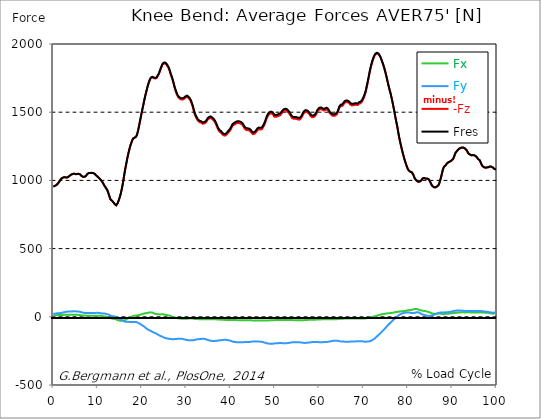
| Category |  Fx |  Fy |  -Fz |  Fres |
|---|---|---|---|---|
| 0.0 | 11.994 | 21.394 | 954.383 | 954.986 |
| 0.167348456675344 | 11.903 | 21.915 | 956.968 | 957.571 |
| 0.334696913350688 | 11.812 | 22.436 | 959.544 | 960.147 |
| 0.5020453700260321 | 11.967 | 23.651 | 962.02 | 962.632 |
| 0.669393826701376 | 12.232 | 24.948 | 965.318 | 965.939 |
| 0.83674228337672 | 12.552 | 25.871 | 970.945 | 971.566 |
| 1.0040907400520642 | 12.935 | 26.894 | 976.179 | 976.81 |
| 1.1621420602454444 | 13.045 | 27.287 | 981.624 | 982.245 |
| 1.3294905169207885 | 12.57 | 26.784 | 989.681 | 990.284 |
| 1.4968389735961325 | 12.89 | 27.031 | 999.319 | 999.922 |
| 1.6641874302714765 | 13.52 | 27.935 | 1007.339 | 1007.951 |
| 1.8315358869468206 | 13.62 | 29.004 | 1013.323 | 1013.944 |
| 1.9988843436221646 | 13.812 | 30.338 | 1017.443 | 1018.082 |
| 2.1662328002975086 | 13.949 | 31.608 | 1020.357 | 1021.033 |
| 2.333581256972853 | 14.196 | 32.877 | 1022.312 | 1023.015 |
| 2.5009297136481967 | 14.662 | 34.193 | 1023.116 | 1023.865 |
| 2.6682781703235405 | 14.909 | 35.399 | 1022.759 | 1023.554 |
| 2.8356266269988843 | 15.146 | 36.385 | 1020.211 | 1021.033 |
| 3.002975083674229 | 15.575 | 37.509 | 1020.101 | 1020.951 |
| 3.1703235403495724 | 16.005 | 38.477 | 1021.8 | 1022.677 |
| 3.337671997024917 | 15.813 | 38.395 | 1024.376 | 1025.253 |
| 3.4957233172182973 | 15.155 | 37.993 | 1027.628 | 1028.478 |
| 3.663071773893641 | 14.726 | 38.221 | 1033.612 | 1034.471 |
| 3.8304202305689854 | 14.58 | 38.45 | 1038.581 | 1039.449 |
| 3.997768687244329 | 14.872 | 38.888 | 1041.505 | 1042.382 |
| 4.165117143919673 | 15.374 | 39.308 | 1044.236 | 1045.131 |
| 4.332465600595017 | 15.676 | 39.729 | 1046.337 | 1047.251 |
| 4.499814057270361 | 15.776 | 40.195 | 1047.945 | 1048.877 |
| 4.667162513945706 | 15.785 | 40.542 | 1049.078 | 1050.028 |
| 4.834510970621049 | 15.511 | 40.496 | 1048.237 | 1049.187 |
| 5.001859427296393 | 15.402 | 40.651 | 1045.935 | 1046.894 |
| 5.169207883971737 | 15.274 | 40.14 | 1045.113 | 1046.063 |
| 5.336556340647081 | 14.516 | 38.943 | 1045.789 | 1046.684 |
| 5.503904797322425 | 13.812 | 38.623 | 1047.141 | 1048.009 |
| 5.671253253997769 | 13.228 | 38.249 | 1047.863 | 1048.721 |
| 5.82930457419115 | 12.926 | 37.819 | 1046.922 | 1047.762 |
| 5.996653030866494 | 12.725 | 36.979 | 1044.273 | 1045.095 |
| 6.164001487541838 | 12.223 | 35.737 | 1040.29 | 1041.085 |
| 6.331349944217181 | 10.642 | 33.069 | 1032.744 | 1033.539 |
| 6.498698400892526 | 9.61 | 31.196 | 1027.336 | 1028.14 |
| 6.66604685756787 | 9.364 | 30.347 | 1026.103 | 1026.916 |
| 6.833395314243213 | 9.19 | 29.178 | 1025.345 | 1026.121 |
| 7.000743770918558 | 8.98 | 28.739 | 1025.719 | 1026.505 |
| 7.168092227593902 | 8.77 | 28.611 | 1027.473 | 1028.277 |
| 7.335440684269246 | 8.496 | 28.392 | 1031.374 | 1032.214 |
| 7.50278914094459 | 8.075 | 27.634 | 1037.494 | 1038.362 |
| 7.6701375976199335 | 7.674 | 27.424 | 1046.684 | 1047.57 |
| 7.837486054295278 | 7.436 | 27.716 | 1050.558 | 1051.453 |
| 7.995537374488658 | 7.409 | 27.552 | 1053.581 | 1054.458 |
| 8.162885831164003 | 7.39 | 27.57 | 1055.043 | 1055.92 |
| 8.330234287839346 | 7.701 | 27.524 | 1054.139 | 1055.016 |
| 8.49758274451469 | 7.902 | 27.332 | 1053.627 | 1054.495 |
| 8.664931201190035 | 7.82 | 27.077 | 1054.632 | 1055.5 |
| 8.832279657865378 | 7.728 | 27.095 | 1054.824 | 1055.682 |
| 8.999628114540721 | 7.728 | 27.506 | 1053.371 | 1054.248 |
| 9.166976571216066 | 7.811 | 27.89 | 1050.969 | 1051.855 |
| 9.334325027891412 | 7.829 | 28.346 | 1046.894 | 1047.808 |
| 9.501673484566755 | 7.929 | 28.849 | 1041.569 | 1042.5 |
| 9.669021941242098 | 8.313 | 29.041 | 1035.686 | 1036.636 |
| 9.836370397917442 | 8.587 | 29.05 | 1030.488 | 1031.438 |
| 10.003718854592787 | 8.541 | 29.141 | 1026.468 | 1027.418 |
| 10.17106731126813 | 8.514 | 28.949 | 1021.901 | 1022.842 |
| 10.329118631461512 | 8.249 | 28.282 | 1016.073 | 1017.004 |
| 10.496467088136853 | 7.555 | 26.711 | 1010.144 | 1011.03 |
| 10.663815544812199 | 6.998 | 25.999 | 1004.343 | 1005.183 |
| 10.831164001487544 | 5.938 | 25.24 | 997.802 | 998.634 |
| 10.998512458162887 | 5.116 | 24.802 | 990.193 | 991.006 |
| 11.16586091483823 | 4.769 | 25.167 | 981.761 | 982.583 |
| 11.333209371513574 | 3.855 | 24.628 | 971.785 | 972.571 |
| 11.50055782818892 | 2.403 | 23.559 | 961.728 | 962.477 |
| 11.667906284864264 | 2.165 | 23.514 | 953.433 | 954.155 |
| 11.835254741539607 | 0.676 | 21.394 | 944.855 | 945.495 |
| 12.00260319821495 | -0.731 | 19.202 | 937.291 | 937.858 |
| 12.169951654890292 | -1.608 | 18.416 | 927.909 | 928.448 |
| 12.337300111565641 | -2.576 | 17.841 | 914.353 | 914.883 |
| 12.504648568240984 | -4.083 | 15.776 | 897.279 | 897.764 |
| 12.662699888434362 | -6.376 | 12.881 | 880.608 | 881.037 |
| 12.830048345109708 | -8.678 | 9.948 | 864.402 | 864.795 |
| 12.997396801785053 | -10.944 | 6.723 | 856.729 | 857.131 |
| 13.164745258460396 | -12.597 | 4.33 | 852.444 | 852.883 |
| 13.33209371513574 | -13.657 | 3.755 | 847.201 | 847.639 |
| 13.499442171811083 | -14.634 | 3.27 | 841.857 | 842.286 |
| 13.666790628486426 | -15.027 | 3.462 | 833.818 | 834.229 |
| 13.834139085161771 | -16.014 | 2.266 | 826.363 | 826.774 |
| 14.001487541837117 | -17.311 | 0.365 | 819.211 | 819.631 |
| 14.16883599851246 | -18.901 | -2.028 | 817.237 | 817.685 |
| 14.336184455187803 | -21.458 | -5.737 | 822.636 | 823.139 |
| 14.503532911863147 | -24.272 | -10.076 | 832.429 | 833.023 |
| 14.670881368538492 | -26.172 | -13.493 | 846.342 | 847.018 |
| 14.828932688731873 | -27.725 | -16.745 | 862.493 | 863.242 |
| 14.996281145407215 | -28.52 | -18.581 | 878.534 | 879.338 |
| 15.163629602082558 | -28.62 | -20.837 | 897.901 | 898.732 |
| 15.330978058757903 | -28.52 | -23.295 | 920.556 | 921.433 |
| 15.498326515433247 | -28.301 | -25.569 | 946.828 | 947.742 |
| 15.665674972108594 | -27.67 | -27.707 | 975.851 | 976.801 |
| 15.833023428783937 | -27.862 | -30.822 | 1008.49 | 1009.523 |
| 16.00037188545928 | -27.003 | -34.147 | 1041.541 | 1042.619 |
| 16.167720342134626 | -24.245 | -35.426 | 1075.46 | 1076.501 |
| 16.335068798809967 | -21.394 | -36.175 | 1103.048 | 1104.035 |
| 16.502417255485312 | -17.667 | -35.746 | 1130.947 | 1131.869 |
| 16.669765712160658 | -14.452 | -35.746 | 1159.065 | 1159.951 |
| 16.837114168836 | -10.926 | -36.431 | 1185.036 | 1185.913 |
| 17.004462625511344 | -8.267 | -37.171 | 1207.773 | 1208.65 |
| 17.16251394570472 | -5.646 | -37.993 | 1230.319 | 1231.223 |
| 17.32986240238007 | -2.804 | -38.395 | 1249.923 | 1250.827 |
| 17.497210859055414 | -0.758 | -38.532 | 1266.192 | 1267.097 |
| 17.664559315730756 | 1.279 | -38.66 | 1282.115 | 1283.019 |
| 17.8319077724061 | 3.362 | -38.696 | 1296.347 | 1297.233 |
| 17.999256229081443 | 5.445 | -38.861 | 1307.2 | 1308.095 |
| 18.166604685756788 | 7.153 | -38.925 | 1313.439 | 1314.334 |
| 18.333953142432133 | 7.893 | -38.24 | 1312.334 | 1313.22 |
| 18.501301599107478 | 8.514 | -37.774 | 1312.654 | 1313.521 |
| 18.668650055782823 | 8.98 | -38.413 | 1320.336 | 1321.231 |
| 18.835998512458165 | 9.345 | -39.811 | 1332.111 | 1333.061 |
| 19.00334696913351 | 10.396 | -41.857 | 1350.135 | 1351.149 |
| 19.170695425808855 | 11.702 | -44.662 | 1372.817 | 1373.923 |
| 19.338043882484197 | 13.008 | -47.722 | 1399.136 | 1400.332 |
| 19.496095202677576 | 14.306 | -50.819 | 1426.715 | 1427.994 |
| 19.66344365935292 | 15.585 | -54.107 | 1454.138 | 1455.518 |
| 19.830792116028263 | 17.064 | -57.807 | 1481.297 | 1482.823 |
| 19.998140572703612 | 18.855 | -61.214 | 1507.798 | 1509.479 |
| 20.165489029378953 | 20.572 | -64.741 | 1532.755 | 1534.591 |
| 20.3328374860543 | 22.6 | -68.468 | 1558.151 | 1560.151 |
| 20.500185942729644 | 24.254 | -72.688 | 1585.173 | 1587.365 |
| 20.667534399404985 | 25.542 | -76.662 | 1610.075 | 1612.441 |
| 20.83488285608033 | 26.053 | -81.275 | 1632.145 | 1634.758 |
| 21.002231312755672 | 26.51 | -85.633 | 1653.43 | 1656.253 |
| 21.16957976943102 | 27.853 | -89.698 | 1675.756 | 1678.789 |
| 21.336928226106362 | 29.58 | -93.05 | 1695.717 | 1698.941 |
| 21.504276682781704 | 30.758 | -96.248 | 1713.174 | 1716.554 |
| 21.67162513945705 | 31.699 | -99.116 | 1728.731 | 1732.257 |
| 21.82967645965043 | 32.32 | -101.592 | 1741.045 | 1744.708 |
| 21.997024916325774 | 32.53 | -103.985 | 1750.244 | 1754.026 |
| 22.16437337300112 | 32.083 | -106.726 | 1755.205 | 1759.124 |
| 22.33172182967646 | 30.557 | -109.722 | 1755.415 | 1759.471 |
| 22.499070286351806 | 28.355 | -112.919 | 1754.711 | 1758.895 |
| 22.666418743027148 | 25.77 | -115.249 | 1749.806 | 1754.118 |
| 22.833767199702496 | 23.569 | -117.377 | 1746.837 | 1751.277 |
| 23.00111565637784 | 21.851 | -119.634 | 1747.193 | 1751.761 |
| 23.168464113053183 | 20.326 | -122.338 | 1747.54 | 1752.281 |
| 23.335812569728528 | 19.321 | -125.818 | 1751.249 | 1756.228 |
| 23.50316102640387 | 18.827 | -128.486 | 1761.983 | 1767.117 |
| 23.670509483079215 | 18.298 | -132.039 | 1772.105 | 1777.467 |
| 23.83785793975456 | 17.421 | -135.52 | 1782.299 | 1787.89 |
| 23.995909259947936 | 17.539 | -138.47 | 1796.797 | 1802.57 |
| 24.163257716623285 | 17.96 | -140.69 | 1812.016 | 1817.917 |
| 24.330606173298627 | 17.85 | -142.873 | 1827.08 | 1833.109 |
| 24.49795462997397 | 18.06 | -145.139 | 1839.449 | 1845.633 |
| 24.665303086649313 | 18.124 | -147.505 | 1850.475 | 1856.824 |
| 24.83265154332466 | 17.539 | -150.136 | 1856.358 | 1862.908 |
| 25.0 | 16.708 | -152.447 | 1858.121 | 1864.826 |
| 25.167348456675345 | 15.84 | -154.32 | 1858.331 | 1865.182 |
| 25.334696913350694 | 14.854 | -155.946 | 1855.088 | 1862.067 |
| 25.502045370026035 | 13.739 | -157.544 | 1849.552 | 1856.678 |
| 25.669393826701377 | 12.506 | -159.061 | 1841.696 | 1848.94 |
| 25.836742283376722 | 11.492 | -160.002 | 1832.415 | 1839.768 |
| 26.004090740052067 | 10.167 | -160.97 | 1821.982 | 1829.455 |
| 26.17143919672741 | 8.642 | -161.947 | 1808.417 | 1816.008 |
| 26.329490516920792 | 7.226 | -162.048 | 1792.056 | 1799.702 |
| 26.49683897359613 | 4.906 | -161.838 | 1772.169 | 1779.815 |
| 26.66418743027148 | 2.202 | -163.217 | 1758.749 | 1766.541 |
| 26.831535886946828 | -0.091 | -164.642 | 1742.397 | 1750.372 |
| 26.998884343622166 | -1.717 | -165.273 | 1723.159 | 1731.261 |
| 27.166232800297514 | -2.914 | -164.176 | 1702.988 | 1711.119 |
| 27.333581256972852 | -4.476 | -163.245 | 1680.708 | 1688.893 |
| 27.5009297136482 | -5.7 | -162.742 | 1663.506 | 1671.746 |
| 27.668278170323543 | -7.208 | -162.578 | 1646.78 | 1655.102 |
| 27.835626626998888 | -8.688 | -161.856 | 1632.209 | 1640.55 |
| 28.002975083674233 | -9.957 | -161.335 | 1619.868 | 1628.226 |
| 28.170323540349575 | -11.063 | -160.997 | 1610.276 | 1618.671 |
| 28.33767199702492 | -12.159 | -160.796 | 1604.658 | 1613.08 |
| 28.50502045370026 | -12.771 | -160.257 | 1599.588 | 1608.001 |
| 28.663071773893645 | -13.109 | -160.431 | 1595.751 | 1604.228 |
| 28.830420230568986 | -13.429 | -160.833 | 1592.983 | 1601.534 |
| 28.99776868724433 | -13.566 | -161.089 | 1590.992 | 1599.588 |
| 29.165117143919673 | -13.383 | -161.947 | 1592.828 | 1601.524 |
| 29.33246560059502 | -13.593 | -163.948 | 1597.231 | 1606.129 |
| 29.499814057270367 | -13.529 | -165.227 | 1598.619 | 1607.636 |
| 29.66716251394571 | -13.748 | -166.497 | 1603.434 | 1612.551 |
| 29.834510970621054 | -13.748 | -167.803 | 1607.453 | 1616.68 |
| 30.00185942729639 | -13.675 | -169.137 | 1611.043 | 1620.388 |
| 30.169207883971744 | -13.474 | -170.197 | 1611.902 | 1621.348 |
| 30.33655634064708 | -13.301 | -171.055 | 1609.171 | 1618.735 |
| 30.50390479732243 | -12.533 | -171.357 | 1603.744 | 1613.391 |
| 30.671253253997772 | -11.693 | -171.402 | 1598.062 | 1607.764 |
| 30.829304574191156 | -11.163 | -171.896 | 1590.343 | 1600.154 |
| 30.996653030866494 | -11.328 | -172.362 | 1579.472 | 1589.411 |
| 31.164001487541842 | -11.949 | -172.736 | 1565.614 | 1575.672 |
| 31.331349944217187 | -12.552 | -172.435 | 1550.331 | 1560.435 |
| 31.498698400892525 | -13.337 | -172.27 | 1532.518 | 1542.694 |
| 31.666046857567874 | -14.333 | -171.676 | 1510.84 | 1521.071 |
| 31.833395314243212 | -15.247 | -169.694 | 1489.811 | 1499.96 |
| 32.00074377091856 | -15.667 | -168.598 | 1475.779 | 1485.883 |
| 32.1680922275939 | -15.804 | -166.844 | 1463.529 | 1473.505 |
| 32.33544068426925 | -16.215 | -165.273 | 1453.608 | 1463.456 |
| 32.50278914094459 | -16.617 | -164.56 | 1443.414 | 1453.261 |
| 32.670137597619934 | -17.064 | -164.103 | 1435.74 | 1445.588 |
| 32.83748605429528 | -17.412 | -163.793 | 1430.762 | 1440.609 |
| 33.004834510970625 | -17.795 | -163.647 | 1426.769 | 1436.617 |
| 33.162885831164004 | -17.987 | -163.336 | 1425.153 | 1434.982 |
| 33.33023428783935 | -17.896 | -162.724 | 1423.664 | 1433.429 |
| 33.497582744514695 | -17.613 | -161.893 | 1420.119 | 1429.821 |
| 33.664931201190036 | -17.284 | -161.134 | 1415.953 | 1425.6 |
| 33.83227965786538 | -17.101 | -161.162 | 1415.524 | 1425.171 |
| 33.99962811454073 | -17.265 | -161.591 | 1417.534 | 1427.217 |
| 34.16697657121607 | -17.412 | -162.898 | 1419.151 | 1428.989 |
| 34.33432502789141 | -17.43 | -164.414 | 1422.503 | 1432.506 |
| 34.50167348456676 | -17.265 | -165.693 | 1428.386 | 1438.508 |
| 34.6690219412421 | -17.375 | -167.483 | 1437.668 | 1447.936 |
| 34.83637039791744 | -17.421 | -169.95 | 1446.949 | 1457.436 |
| 35.00371885459279 | -17.457 | -171.375 | 1452.558 | 1463.182 |
| 35.17106731126814 | -17.594 | -173.312 | 1455.189 | 1466.032 |
| 35.338415767943474 | -17.613 | -174.965 | 1457.564 | 1468.599 |
| 35.49646708813686 | -17.64 | -175.705 | 1457.957 | 1469.074 |
| 35.6638155448122 | -17.75 | -176.262 | 1455.362 | 1466.589 |
| 35.831164001487544 | -18.142 | -177.112 | 1449.827 | 1461.227 |
| 35.998512458162885 | -18.243 | -177.66 | 1445.323 | 1456.833 |
| 36.165860914838234 | -18.252 | -177.87 | 1440.253 | 1451.827 |
| 36.333209371513576 | -18.252 | -177.404 | 1432.214 | 1443.797 |
| 36.50055782818892 | -18.343 | -176.719 | 1423.024 | 1434.589 |
| 36.667906284864266 | -18.535 | -175.623 | 1412.208 | 1423.718 |
| 36.83525474153961 | -18.946 | -175.102 | 1399.693 | 1411.24 |
| 37.002603198214956 | -19.403 | -174.929 | 1387.059 | 1398.697 |
| 37.1699516548903 | -19.476 | -174.088 | 1374.635 | 1386.283 |
| 37.337300111565646 | -19.659 | -172.636 | 1365.226 | 1376.755 |
| 37.50464856824098 | -20.335 | -171.932 | 1357.47 | 1368.999 |
| 37.66269988843437 | -20.609 | -171.695 | 1353.04 | 1364.578 |
| 37.83004834510971 | -20.883 | -171.366 | 1349.861 | 1361.371 |
| 37.99739680178505 | -21.267 | -171.019 | 1344.033 | 1355.561 |
| 38.16474525846039 | -21.422 | -170.169 | 1336.451 | 1347.942 |
| 38.33209371513574 | -21.815 | -169.429 | 1331.636 | 1343.083 |
| 38.49944217181109 | -22.262 | -168.899 | 1329.051 | 1340.47 |
| 38.666790628486424 | -22.555 | -168.753 | 1328.348 | 1339.757 |
| 38.83413908516178 | -22.865 | -168.689 | 1328.713 | 1340.114 |
| 39.001487541837115 | -23.002 | -169.018 | 1333.244 | 1344.654 |
| 39.16883599851246 | -23.304 | -169.721 | 1339.52 | 1350.984 |
| 39.336184455187805 | -23.45 | -170.644 | 1346.426 | 1357.964 |
| 39.503532911863154 | -23.66 | -171.667 | 1352.921 | 1364.55 |
| 39.670881368538495 | -23.934 | -173.156 | 1358.311 | 1370.077 |
| 39.83822982521384 | -23.888 | -174.664 | 1364.906 | 1376.819 |
| 39.996281145407224 | -23.806 | -175.723 | 1374.16 | 1386.118 |
| 40.163629602082565 | -24.098 | -177.651 | 1384.383 | 1396.505 |
| 40.33097805875791 | -24.254 | -180.675 | 1395.573 | 1407.988 |
| 40.498326515433256 | -24.235 | -181.99 | 1401.721 | 1414.236 |
| 40.6656749721086 | -24.245 | -183.059 | 1406.782 | 1419.388 |
| 40.83302342878393 | -24.226 | -183.963 | 1410.116 | 1422.796 |
| 41.00037188545929 | -24.062 | -184.539 | 1413.122 | 1425.838 |
| 41.16772034213463 | -24.135 | -185.525 | 1415.926 | 1428.752 |
| 41.33506879880997 | -24.19 | -186.165 | 1419.589 | 1432.452 |
| 41.50241725548531 | -24.327 | -186.265 | 1421.398 | 1434.251 |
| 41.66976571216066 | -24.665 | -186.923 | 1420.585 | 1433.529 |
| 41.837114168836 | -24.793 | -187.234 | 1420.183 | 1433.182 |
| 42.004462625511344 | -24.848 | -187.444 | 1419.562 | 1432.589 |
| 42.17181108218669 | -24.921 | -187.672 | 1417.908 | 1430.981 |
| 42.32986240238007 | -24.838 | -187.398 | 1414.583 | 1427.646 |
| 42.497210859055414 | -24.756 | -187.124 | 1411.249 | 1424.303 |
| 42.66455931573076 | -24.802 | -186.85 | 1406.955 | 1420.019 |
| 42.831907772406105 | -25.049 | -186.567 | 1399.912 | 1412.994 |
| 42.999256229081446 | -25.396 | -185.735 | 1388.722 | 1401.812 |
| 43.16660468575679 | -25.697 | -185.617 | 1379.386 | 1392.568 |
| 43.33395314243214 | -25.88 | -185.388 | 1373.64 | 1386.858 |
| 43.50130159910748 | -25.944 | -185.16 | 1370.031 | 1383.259 |
| 43.66865005578282 | -26.072 | -185.343 | 1368.624 | 1381.898 |
| 43.83599851245817 | -26.099 | -185.251 | 1368.359 | 1381.615 |
| 44.00334696913351 | -26.126 | -185.151 | 1368.104 | 1381.35 |
| 44.17069542580886 | -26.154 | -184.639 | 1366.231 | 1379.422 |
| 44.3380438824842 | -26.181 | -184.054 | 1363.427 | 1376.554 |
| 44.49609520267758 | -26.327 | -183.817 | 1358.448 | 1371.584 |
| 44.66344365935292 | -26.181 | -182.629 | 1350.382 | 1363.436 |
| 44.83079211602827 | -26.209 | -181.643 | 1344.48 | 1357.452 |
| 44.99814057270361 | -26.291 | -180.711 | 1339.2 | 1352.099 |
| 45.16548902937895 | -26.501 | -180.318 | 1338.561 | 1351.423 |
| 45.332837486054295 | -26.675 | -180.062 | 1341.42 | 1354.218 |
| 45.500185942729644 | -26.83 | -180.008 | 1346.006 | 1358.749 |
| 45.66753439940499 | -27.022 | -180.419 | 1351.56 | 1364.304 |
| 45.83488285608033 | -27.058 | -180.41 | 1358.841 | 1371.502 |
| 46.00223131275568 | -26.949 | -181.14 | 1367.565 | 1380.226 |
| 46.16957976943102 | -26.912 | -181.168 | 1371.411 | 1384.026 |
| 46.336928226106366 | -26.857 | -181.597 | 1374.471 | 1387.105 |
| 46.50427668278171 | -26.702 | -182.456 | 1375.576 | 1388.32 |
| 46.671625139457056 | -26.592 | -182.255 | 1373.64 | 1386.365 |
| 46.829676459650436 | -26.583 | -181.99 | 1371.593 | 1384.3 |
| 46.99702491632577 | -26.903 | -183.132 | 1374.416 | 1387.269 |
| 47.16437337300112 | -27.259 | -184.21 | 1380.719 | 1393.664 |
| 47.33172182967646 | -27.433 | -185.735 | 1389.708 | 1402.772 |
| 47.49907028635181 | -27.542 | -187.517 | 1400.223 | 1413.432 |
| 47.66641874302716 | -27.588 | -189.618 | 1413.112 | 1426.486 |
| 47.83376719970249 | -27.542 | -191.39 | 1426.843 | 1440.308 |
| 48.001115656377834 | -27.597 | -192.623 | 1443.359 | 1456.833 |
| 48.16846411305319 | -27.57 | -193.966 | 1458.222 | 1471.723 |
| 48.33581256972853 | -27.204 | -195.346 | 1468.782 | 1482.357 |
| 48.50316102640387 | -26.93 | -196.433 | 1478.237 | 1491.866 |
| 48.67050948307921 | -26.437 | -197.118 | 1484.905 | 1498.562 |
| 48.837857939754564 | -25.898 | -197.437 | 1488.806 | 1502.454 |
| 49.005206396429905 | -25.524 | -197.629 | 1491.044 | 1504.692 |
| 49.163257716623285 | -25.112 | -197.456 | 1490.651 | 1504.281 |
| 49.33060617329863 | -24.72 | -197.428 | 1488.651 | 1502.29 |
| 49.49795462997397 | -24.573 | -197.173 | 1485.444 | 1499.065 |
| 49.66530308664932 | -24.482 | -196.524 | 1477.424 | 1491.026 |
| 49.832651543324666 | -24.573 | -195.071 | 1467.466 | 1480.968 |
| 50.0 | -24.336 | -194.889 | 1465.018 | 1478.511 |
| 50.16734845667534 | -24.08 | -194.459 | 1465.886 | 1479.315 |
| 50.33469691335069 | -23.724 | -194.149 | 1466.416 | 1479.79 |
| 50.50204537002604 | -23.76 | -193.582 | 1468.334 | 1481.617 |
| 50.66939382670139 | -24.062 | -193.208 | 1470.883 | 1484.083 |
| 50.836742283376715 | -24.135 | -192.861 | 1473.651 | 1486.76 |
| 51.00409074005207 | -24.181 | -192.897 | 1475.24 | 1488.331 |
| 51.17143919672741 | -23.925 | -192.906 | 1478.1 | 1491.154 |
| 51.32949051692079 | -23.697 | -192.779 | 1484.028 | 1497.009 |
| 51.496838973596134 | -23.468 | -192.888 | 1491.081 | 1504.016 |
| 51.66418743027148 | -23.258 | -193.098 | 1498.672 | 1511.58 |
| 51.831535886946824 | -23.295 | -193.473 | 1505.615 | 1518.514 |
| 51.99888434362217 | -23.267 | -193.582 | 1508.885 | 1521.775 |
| 52.16623280029752 | -23.212 | -193.811 | 1511.434 | 1524.342 |
| 52.33358125697285 | -22.92 | -193.793 | 1512.521 | 1525.429 |
| 52.5009297136482 | -22.765 | -193.637 | 1511.781 | 1524.689 |
| 52.668278170323546 | -22.765 | -193.391 | 1509.799 | 1522.707 |
| 52.835626626998895 | -22.765 | -193.089 | 1504.29 | 1517.198 |
| 53.00297508367424 | -22.902 | -192.24 | 1498.124 | 1510.968 |
| 53.17032354034958 | -23.066 | -191.216 | 1491.738 | 1504.509 |
| 53.33767199702492 | -23.34 | -190.385 | 1484.193 | 1496.927 |
| 53.50502045370027 | -23.514 | -189.545 | 1476.574 | 1489.272 |
| 53.663071773893655 | -23.669 | -188.083 | 1465.904 | 1478.511 |
| 53.83042023056899 | -23.843 | -187.033 | 1458.386 | 1470.929 |
| 53.99776868724433 | -24.144 | -186.494 | 1454.284 | 1466.809 |
| 54.16511714391967 | -24.546 | -186.311 | 1451.955 | 1464.498 |
| 54.33246560059503 | -24.784 | -186.448 | 1451.535 | 1464.114 |
| 54.49981405727037 | -24.829 | -186.238 | 1452.914 | 1465.448 |
| 54.667162513945705 | -24.802 | -186.028 | 1454.23 | 1466.708 |
| 54.834510970621054 | -24.774 | -185.918 | 1451.718 | 1464.196 |
| 55.0018594272964 | -24.893 | -185.964 | 1448.52 | 1461.054 |
| 55.169207883971744 | -25.049 | -185.945 | 1446.447 | 1459.007 |
| 55.336556340647086 | -25.222 | -185.891 | 1445.277 | 1457.838 |
| 55.50390479732243 | -25.441 | -186.585 | 1445.286 | 1457.957 |
| 55.671253253997776 | -25.432 | -187.188 | 1448.502 | 1461.227 |
| 55.83860171067312 | -25.46 | -187.654 | 1454.138 | 1466.882 |
| 55.9966530308665 | -25.286 | -188.54 | 1461.949 | 1474.747 |
| 56.16400148754184 | -25.167 | -189.974 | 1472.125 | 1485.015 |
| 56.33134994421718 | -24.857 | -190.933 | 1484.019 | 1496.936 |
| 56.498698400892536 | -24.491 | -191.344 | 1492.981 | 1505.871 |
| 56.66604685756788 | -24.062 | -191.436 | 1498.243 | 1511.087 |
| 56.83339531424321 | -23.779 | -190.97 | 1501.787 | 1514.531 |
| 57.00074377091856 | -23.496 | -190.632 | 1502.545 | 1515.234 |
| 57.16809222759391 | -23.258 | -190.394 | 1501.148 | 1513.818 |
| 57.33544068426925 | -22.847 | -189.956 | 1497.996 | 1510.621 |
| 57.5027891409446 | -22.281 | -189.335 | 1495 | 1507.561 |
| 57.670137597619934 | -21.869 | -188.649 | 1489.857 | 1502.372 |
| 57.83748605429528 | -21.824 | -188.238 | 1480.886 | 1493.41 |
| 58.004834510970625 | -21.806 | -187.179 | 1473.222 | 1485.673 |
| 58.16288583116401 | -21.915 | -186.201 | 1467.32 | 1479.689 |
| 58.330234287839346 | -22.034 | -185.69 | 1463.438 | 1475.77 |
| 58.497582744514695 | -21.906 | -185.078 | 1462.945 | 1475.204 |
| 58.66493120119004 | -21.705 | -184.484 | 1464.315 | 1476.483 |
| 58.832279657865385 | -21.44 | -184.648 | 1466.178 | 1478.337 |
| 58.999628114540734 | -21.166 | -184.667 | 1470.545 | 1482.667 |
| 59.16697657121607 | -20.655 | -184.685 | 1477.497 | 1489.546 |
| 59.33432502789142 | -20.262 | -184.603 | 1487.436 | 1499.394 |
| 59.50167348456676 | -19.668 | -184.794 | 1500.801 | 1512.685 |
| 59.66902194124211 | -19.54 | -185.005 | 1509.031 | 1520.87 |
| 59.83637039791745 | -19.577 | -185.808 | 1515.563 | 1527.448 |
| 60.00371885459278 | -19.531 | -186.548 | 1520.834 | 1532.773 |
| 60.17106731126813 | -19.357 | -186.932 | 1523.328 | 1535.295 |
| 60.33841576794349 | -19.074 | -186.959 | 1523.008 | 1534.984 |
| 60.49646708813685 | -18.809 | -186.786 | 1521.738 | 1533.714 |
| 60.6638155448122 | -18.426 | -186.448 | 1517.874 | 1529.832 |
| 60.831164001487544 | -18.398 | -185.918 | 1513.827 | 1525.749 |
| 60.99851245816289 | -18.307 | -185.434 | 1512.274 | 1524.15 |
| 61.16586091483824 | -18.225 | -185.068 | 1512.731 | 1524.561 |
| 61.333209371513576 | -18.261 | -184.968 | 1516.458 | 1528.261 |
| 61.50055782818892 | -18.225 | -184.831 | 1519.884 | 1531.659 |
| 61.667906284864266 | -17.987 | -184.566 | 1520.806 | 1532.545 |
| 61.835254741539615 | -17.951 | -184.109 | 1517.746 | 1529.457 |
| 62.002603198214956 | -18.014 | -183.315 | 1512.347 | 1524.004 |
| 62.16995165489029 | -18.161 | -182.246 | 1503.011 | 1514.613 |
| 62.33730011156564 | -18.307 | -180.949 | 1492.926 | 1504.455 |
| 62.504648568240995 | -18.316 | -179.807 | 1485.983 | 1497.43 |
| 62.67199702491633 | -18.088 | -178.619 | 1482.037 | 1493.374 |
| 62.83004834510971 | -17.768 | -177.532 | 1476.894 | 1488.13 |
| 62.99739680178505 | -17.622 | -176.619 | 1473.395 | 1484.54 |
| 63.1647452584604 | -17.521 | -176.107 | 1472.646 | 1483.718 |
| 63.33209371513575 | -17.485 | -176.025 | 1473.404 | 1484.449 |
| 63.4994421718111 | -17.503 | -176.098 | 1474.345 | 1485.38 |
| 63.666790628486424 | -17.475 | -176.006 | 1476.382 | 1487.381 |
| 63.83413908516177 | -17.329 | -175.751 | 1480.941 | 1491.866 |
| 64.00148754183712 | -17.092 | -175.869 | 1487.655 | 1498.544 |
| 64.16883599851248 | -16.608 | -176.143 | 1499.01 | 1509.863 |
| 64.3361844551878 | -16.014 | -176.865 | 1514.33 | 1525.164 |
| 64.50353291186315 | -15.329 | -178.473 | 1530.618 | 1541.525 |
| 64.6708813685385 | -15.1 | -179.633 | 1537.78 | 1548.778 |
| 64.83822982521384 | -14.881 | -180.601 | 1544.348 | 1555.419 |
| 65.00557828188919 | -14.662 | -181.223 | 1547.024 | 1558.151 |
| 65.16362960208257 | -14.415 | -181.241 | 1546.092 | 1557.228 |
| 65.3309780587579 | -14.159 | -181.076 | 1547.746 | 1558.854 |
| 65.49832651543326 | -13.794 | -181.588 | 1560.298 | 1571.388 |
| 65.6656749721086 | -13.255 | -182.164 | 1568.391 | 1579.509 |
| 65.83302342878395 | -13.136 | -182.629 | 1572.201 | 1583.373 |
| 66.00037188545929 | -13.008 | -182.858 | 1574.128 | 1585.337 |
| 66.16772034213463 | -12.908 | -183.287 | 1574.457 | 1585.721 |
| 66.33506879880998 | -12.707 | -183.534 | 1573.653 | 1584.962 |
| 66.50241725548531 | -12.415 | -183.625 | 1571.854 | 1583.19 |
| 66.66976571216065 | -12.205 | -183.278 | 1568.337 | 1579.655 |
| 66.83711416883601 | -12.314 | -182.301 | 1562.399 | 1573.662 |
| 67.00446262551135 | -12.479 | -181.268 | 1556.278 | 1567.469 |
| 67.1718110821867 | -12.698 | -180.4 | 1550.742 | 1561.878 |
| 67.32986240238007 | -12.935 | -180.245 | 1549.61 | 1560.754 |
| 67.49721085905541 | -13.027 | -180.446 | 1550.377 | 1561.558 |
| 67.66455931573076 | -12.944 | -180.519 | 1551.3 | 1562.481 |
| 67.83190777240611 | -12.871 | -180.528 | 1552.496 | 1563.659 |
| 67.99925622908145 | -12.807 | -180.41 | 1554.168 | 1565.304 |
| 68.16660468575678 | -12.89 | -180.446 | 1554.488 | 1565.623 |
| 68.33395314243214 | -12.935 | -179.962 | 1553.903 | 1564.993 |
| 68.50130159910749 | -12.789 | -179.441 | 1553.008 | 1564.043 |
| 68.66865005578282 | -12.652 | -179.222 | 1553.355 | 1564.354 |
| 68.83599851245816 | -12.899 | -179.24 | 1557.265 | 1568.236 |
| 69.00334696913352 | -12.817 | -179.304 | 1562.773 | 1573.699 |
| 69.17069542580886 | -12.661 | -179.359 | 1565.167 | 1576.083 |
| 69.3380438824842 | -12.524 | -179.277 | 1566.957 | 1577.855 |
| 69.50539233915956 | -12.579 | -179.048 | 1571.643 | 1582.505 |
| 69.66344365935292 | -12.588 | -179.542 | 1579.929 | 1590.809 |
| 69.83079211602826 | -12.543 | -180.675 | 1591.366 | 1602.31 |
| 69.99814057270362 | -12.506 | -181.816 | 1602.803 | 1613.811 |
| 70.16548902937896 | -12.159 | -182.2 | 1617.045 | 1627.989 |
| 70.33283748605429 | -11.684 | -182.237 | 1632.575 | 1643.4 |
| 70.50018594272964 | -11.218 | -182.693 | 1651.996 | 1662.721 |
| 70.667534399405 | -10.524 | -182.1 | 1677.702 | 1688.162 |
| 70.83488285608033 | -9.327 | -181.314 | 1702.851 | 1712.991 |
| 71.00223131275568 | -8.34 | -180.565 | 1728.832 | 1738.725 |
| 71.16957976943102 | -7.18 | -180.446 | 1756.52 | 1766.212 |
| 71.33692822610637 | -5.773 | -179.807 | 1786.438 | 1795.883 |
| 71.50427668278171 | -4.257 | -177.623 | 1811.952 | 1821.023 |
| 71.67162513945706 | -2.832 | -175.467 | 1834.379 | 1843.094 |
| 71.8389735961324 | -1.48 | -172.8 | 1854.814 | 1863.164 |
| 71.99702491632577 | -0.219 | -169.996 | 1873.066 | 1881.041 |
| 72.16437337300113 | 1.087 | -166.707 | 1890.039 | 1897.621 |
| 72.33172182967647 | 2.43 | -163.144 | 1903.924 | 1911.123 |
| 72.49907028635181 | 3.755 | -159.079 | 1915.124 | 1921.912 |
| 72.66641874302715 | 5.07 | -154.119 | 1923.163 | 1929.503 |
| 72.8337671997025 | 6.605 | -149.186 | 1928.653 | 1934.582 |
| 73.00111565637783 | 8.176 | -143.933 | 1930.343 | 1935.87 |
| 73.16846411305319 | 9.866 | -138.836 | 1929.448 | 1934.618 |
| 73.33581256972853 | 11.519 | -133.619 | 1925.776 | 1930.581 |
| 73.50316102640387 | 12.78 | -128.33 | 1919.463 | 1923.93 |
| 73.67050948307921 | 14.37 | -123.16 | 1909.579 | 1913.745 |
| 73.83785793975457 | 15.594 | -117.861 | 1898.781 | 1902.636 |
| 74.00520639642991 | 17.247 | -113.02 | 1884.394 | 1888.029 |
| 74.16325771662328 | 18.636 | -107.932 | 1869.266 | 1872.646 |
| 74.33060617329863 | 19.823 | -101.829 | 1854.695 | 1857.81 |
| 74.49795462997398 | 20.956 | -96.768 | 1838.042 | 1840.938 |
| 74.66530308664932 | 21.796 | -90.712 | 1820.155 | 1822.832 |
| 74.83265154332466 | 22.564 | -84.966 | 1800.259 | 1802.698 |
| 75.00000000000001 | 23.359 | -78.991 | 1779.011 | 1781.185 |
| 75.16734845667534 | 24.391 | -72.734 | 1756.621 | 1758.548 |
| 75.3346969133507 | 25.122 | -66.823 | 1732.76 | 1734.486 |
| 75.50204537002605 | 25.569 | -61.023 | 1709.456 | 1710.981 |
| 75.66939382670138 | 26.044 | -55.13 | 1687.066 | 1688.473 |
| 75.83674228337672 | 26.391 | -49.704 | 1666.146 | 1667.453 |
| 76.00409074005208 | 27.058 | -44.671 | 1645.273 | 1646.497 |
| 76.17143919672742 | 27.753 | -39.601 | 1624.015 | 1625.157 |
| 76.33878765340276 | 28.611 | -34.312 | 1600.291 | 1601.36 |
| 76.49683897359614 | 29.525 | -28.794 | 1574.969 | 1575.937 |
| 76.66418743027148 | 30.52 | -23.167 | 1547.792 | 1548.65 |
| 76.83153588694682 | 31.79 | -18.7 | 1520.733 | 1521.546 |
| 76.99888434362218 | 32.95 | -14.15 | 1492.013 | 1492.78 |
| 77.16623280029752 | 34.083 | -8.386 | 1461.364 | 1462.058 |
| 77.33358125697285 | 34.914 | -4.01 | 1435.557 | 1436.261 |
| 77.5009297136482 | 35.517 | 0 | 1407.586 | 1408.307 |
| 77.66827817032356 | 36.102 | 3.992 | 1379.44 | 1380.189 |
| 77.83562662699889 | 36.979 | 8.834 | 1347.239 | 1347.988 |
| 78.00297508367423 | 37.975 | 13.1 | 1317.778 | 1318.591 |
| 78.17032354034959 | 39.226 | 16.754 | 1291.058 | 1291.953 |
| 78.33767199702493 | 39.838 | 20.207 | 1267.06 | 1268.028 |
| 78.50502045370027 | 40.231 | 22.317 | 1243.3 | 1244.341 |
| 78.67236891037561 | 40.185 | 24.51 | 1220.316 | 1221.421 |
| 78.83042023056899 | 40.761 | 26.108 | 1199.268 | 1200.428 |
| 78.99776868724433 | 41.684 | 27.871 | 1178.459 | 1179.692 |
| 79.16511714391969 | 42.615 | 29.561 | 1158.553 | 1159.859 |
| 79.33246560059503 | 43.547 | 31.105 | 1140.383 | 1141.754 |
| 79.49981405727036 | 43.913 | 31.251 | 1124.105 | 1125.493 |
| 79.66716251394571 | 44.817 | 31.516 | 1107.926 | 1109.379 |
| 79.83451097062107 | 46.744 | 32.037 | 1092.661 | 1094.224 |
| 80.00185942729641 | 48.261 | 32.028 | 1081.005 | 1082.64 |
| 80.16920788397174 | 49.174 | 31.662 | 1072.464 | 1074.145 |
| 80.33655634064709 | 49.604 | 31.114 | 1066.462 | 1068.152 |
| 80.50390479732243 | 49.732 | 30.338 | 1063.054 | 1064.735 |
| 80.67125325399778 | 49.96 | 28.62 | 1062.123 | 1063.776 |
| 80.83860171067312 | 50.773 | 27.478 | 1059.656 | 1061.337 |
| 80.99665303086651 | 52.892 | 27.542 | 1053.536 | 1055.354 |
| 81.16400148754184 | 54.756 | 27.798 | 1042.756 | 1044.702 |
| 81.3313499442172 | 56.373 | 28.027 | 1029.455 | 1031.52 |
| 81.49869840089255 | 57.634 | 29.543 | 1015.506 | 1017.726 |
| 81.66604685756786 | 57.889 | 30.785 | 1006.91 | 1009.203 |
| 81.83339531424322 | 57.643 | 32.512 | 1000.707 | 1003.055 |
| 82.00074377091858 | 57.579 | 33.608 | 995.308 | 997.711 |
| 82.16809222759392 | 55.989 | 33.626 | 991.618 | 993.929 |
| 82.33544068426926 | 53.413 | 32.969 | 988.594 | 990.741 |
| 82.50278914094459 | 51.148 | 31.242 | 989.224 | 991.216 |
| 82.67013759761994 | 49.412 | 27.908 | 991.134 | 993.006 |
| 82.83748605429528 | 47.886 | 24.162 | 994.039 | 995.829 |
| 83.00483451097062 | 47.082 | 21.093 | 999.428 | 1001.21 |
| 83.17218296764597 | 45.867 | 18.965 | 1006.545 | 1008.28 |
| 83.33023428783935 | 44.47 | 16.799 | 1013.487 | 1015.159 |
| 83.4975827445147 | 43.41 | 14.954 | 1015.671 | 1017.306 |
| 83.66493120119004 | 42.743 | 13.282 | 1016.356 | 1017.927 |
| 83.83227965786537 | 42.122 | 11.73 | 1014.118 | 1015.707 |
| 83.99962811454073 | 41.419 | 10.113 | 1011.697 | 1013.286 |
| 84.16697657121607 | 40.012 | 8.267 | 1011.213 | 1012.747 |
| 84.33432502789142 | 38.468 | 7.564 | 1012.163 | 1013.624 |
| 84.50167348456677 | 36.805 | 7.025 | 1011.852 | 1013.232 |
| 84.6690219412421 | 34.805 | 6.13 | 1007.294 | 1008.573 |
| 84.83637039791745 | 33.215 | 5.6 | 999.821 | 1001.045 |
| 85.0037188545928 | 31.096 | 6.166 | 989.389 | 990.531 |
| 85.17106731126813 | 28.419 | 7.683 | 978.29 | 979.331 |
| 85.33841576794349 | 26.19 | 9.528 | 966.441 | 967.465 |
| 85.50576422461883 | 24.957 | 11.355 | 958.375 | 959.398 |
| 85.66381554481221 | 23.569 | 12.762 | 952.51 | 953.543 |
| 85.83116400148755 | 21.879 | 14.379 | 949.971 | 950.985 |
| 85.99851245816289 | 21.65 | 16.626 | 948.838 | 949.788 |
| 86.16586091483823 | 21.751 | 19.074 | 948.381 | 949.267 |
| 86.33320937151358 | 21.76 | 21.751 | 951.094 | 951.971 |
| 86.50055782818893 | 21.915 | 24.199 | 953.908 | 954.785 |
| 86.66790628486427 | 22.536 | 26.364 | 955.863 | 956.786 |
| 86.83525474153961 | 23.678 | 28.31 | 962.477 | 963.472 |
| 87.00260319821496 | 23.788 | 29.689 | 972.927 | 973.978 |
| 87.16995165489031 | 23.496 | 30.192 | 988.265 | 989.352 |
| 87.33730011156564 | 22.957 | 30.941 | 1006.718 | 1007.833 |
| 87.504648568241 | 22.253 | 31.361 | 1027.163 | 1028.286 |
| 87.67199702491634 | 21.184 | 32.147 | 1050.813 | 1051.919 |
| 87.83004834510972 | 20.015 | 32.402 | 1073.295 | 1074.355 |
| 87.99739680178506 | 19.376 | 31.809 | 1090.085 | 1091.108 |
| 88.1647452584604 | 19.175 | 31.37 | 1100.454 | 1101.468 |
| 88.33209371513574 | 19.778 | 31.434 | 1107.351 | 1108.383 |
| 88.49944217181108 | 21.404 | 32.009 | 1110.247 | 1111.324 |
| 88.66679062848644 | 22.445 | 33.343 | 1116.559 | 1117.71 |
| 88.83413908516178 | 22.463 | 34.065 | 1125.082 | 1126.26 |
| 89.00148754183712 | 21.988 | 33.654 | 1129.695 | 1130.837 |
| 89.16883599851246 | 22.555 | 34.028 | 1132.573 | 1133.706 |
| 89.33618445518782 | 23.432 | 34.741 | 1135.642 | 1136.775 |
| 89.50353291186315 | 24.711 | 35.919 | 1138.374 | 1139.543 |
| 89.6708813685385 | 25.88 | 37.043 | 1141.324 | 1142.53 |
| 89.83822982521386 | 26.729 | 37.902 | 1145.134 | 1146.358 |
| 90.00557828188919 | 27.36 | 39.984 | 1149.226 | 1150.423 |
| 90.16362960208257 | 27.588 | 41.501 | 1156.352 | 1157.539 |
| 90.3309780587579 | 28.301 | 43.3 | 1166.957 | 1168.172 |
| 90.49832651543326 | 28.52 | 43.721 | 1182.222 | 1183.437 |
| 90.66567497210859 | 28.748 | 44.506 | 1197.332 | 1198.565 |
| 90.83302342878395 | 29.369 | 45.694 | 1205.955 | 1207.225 |
| 91.00037188545929 | 30.219 | 45.895 | 1212.459 | 1213.748 |
| 91.16772034213463 | 30.904 | 45.941 | 1219.028 | 1220.334 |
| 91.33506879880998 | 31.471 | 45.986 | 1225.742 | 1227.048 |
| 91.50241725548533 | 31.854 | 46.096 | 1230.693 | 1231.999 |
| 91.66976571216065 | 32.21 | 46.205 | 1235.005 | 1236.32 |
| 91.83711416883601 | 32.567 | 46.087 | 1236.731 | 1238.056 |
| 92.00446262551137 | 32.594 | 45.612 | 1238.421 | 1239.728 |
| 92.1718110821867 | 32.612 | 45.128 | 1240.084 | 1241.363 |
| 92.33915953886203 | 32.704 | 44.515 | 1240.504 | 1241.774 |
| 92.49721085905541 | 32.421 | 44.177 | 1239.673 | 1240.925 |
| 92.66455931573077 | 32.43 | 43.702 | 1237.27 | 1238.513 |
| 92.83190777240611 | 32.466 | 43.191 | 1233.845 | 1235.069 |
| 92.99925622908145 | 32.366 | 42.707 | 1229.359 | 1230.565 |
| 93.1666046857568 | 32.649 | 42.624 | 1223.175 | 1224.399 |
| 93.33395314243214 | 32.622 | 41.62 | 1215.757 | 1216.963 |
| 93.50130159910749 | 32.676 | 41.684 | 1204.165 | 1205.389 |
| 93.66865005578283 | 32.731 | 41.601 | 1196.181 | 1197.423 |
| 93.83599851245818 | 32.457 | 41.547 | 1191.778 | 1193.011 |
| 94.00334696913353 | 32.32 | 41.665 | 1188.626 | 1189.859 |
| 94.17069542580886 | 32.274 | 41.775 | 1185.675 | 1186.918 |
| 94.3380438824842 | 32.165 | 41.583 | 1183.209 | 1184.442 |
| 94.50539233915954 | 31.927 | 41.41 | 1183.273 | 1184.497 |
| 94.66344365935292 | 31.936 | 41.921 | 1184.771 | 1186.013 |
| 94.83079211602828 | 32.147 | 42.369 | 1184.387 | 1185.657 |
| 94.99814057270362 | 32.302 | 42.78 | 1182.688 | 1183.976 |
| 95.16548902937897 | 32.22 | 43.191 | 1180.276 | 1181.583 |
| 95.33283748605432 | 31.936 | 43.355 | 1175.681 | 1176.997 |
| 95.50018594272963 | 31.918 | 43.547 | 1170.191 | 1171.525 |
| 95.66753439940499 | 31.854 | 43.447 | 1163.733 | 1165.076 |
| 95.83488285608034 | 31.434 | 42.798 | 1155.1 | 1156.425 |
| 96.00223131275567 | 30.74 | 41.958 | 1151.939 | 1153.218 |
| 96.16957976943102 | 30.566 | 42.186 | 1147.445 | 1148.733 |
| 96.33692822610638 | 31.361 | 42.396 | 1136.793 | 1138.136 |
| 96.50427668278171 | 31.206 | 41.528 | 1122.113 | 1123.429 |
| 96.67162513945706 | 31.279 | 40.889 | 1110.959 | 1112.265 |
| 96.8389735961324 | 31.16 | 40.048 | 1103.368 | 1104.647 |
| 96.99702491632577 | 30.913 | 39.628 | 1099.047 | 1100.298 |
| 97.16437337300111 | 30.758 | 39.646 | 1095.722 | 1096.964 |
| 97.33172182967647 | 30.52 | 38.769 | 1093.392 | 1094.607 |
| 97.49907028635181 | 30.164 | 37.536 | 1092.46 | 1093.621 |
| 97.66641874302715 | 30 | 36.787 | 1093.639 | 1094.772 |
| 97.8337671997025 | 30.201 | 36.641 | 1094.379 | 1095.512 |
| 98.00111565637785 | 30.045 | 36.111 | 1093.054 | 1094.169 |
| 98.16846411305319 | 29.26 | 35.28 | 1096.69 | 1097.759 |
| 98.33581256972855 | 27.953 | 34.101 | 1100.161 | 1101.148 |
| 98.50316102640389 | 26.519 | 32.987 | 1101.413 | 1102.336 |
| 98.67050948307921 | 25.396 | 32.11 | 1101.029 | 1101.906 |
| 98.83785793975456 | 24.181 | 31.206 | 1099.86 | 1100.691 |
| 99.0052063964299 | 23.386 | 30.383 | 1097.467 | 1098.261 |
| 99.17255485310525 | 23.002 | 30.073 | 1093.602 | 1094.388 |
| 99.33060617329863 | 23.231 | 30.594 | 1087.509 | 1088.313 |
| 99.49795462997399 | 23.815 | 30.959 | 1083.161 | 1083.974 |
| 99.66530308664933 | 24.272 | 31.187 | 1080.311 | 1081.142 |
| 99.83265154332467 | 23.897 | 31.215 | 1079.671 | 1080.484 |
| 100.0 | 24.738 | 31.544 | 1076.912 | 1077.762 |